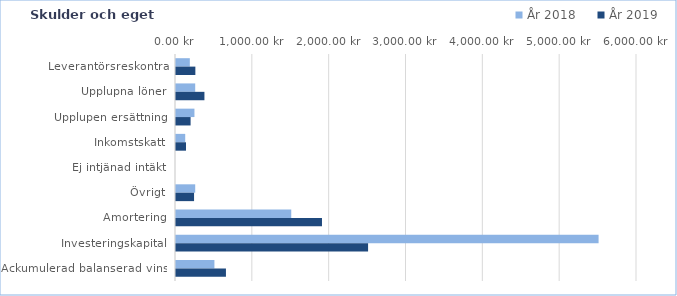
| Category | År 2018 | År 2019 |
|---|---|---|
| Leverantörsreskontra | 180 | 252 |
| Upplupna löner | 250 | 370 |
| Upplupen ersättning | 240 | 190 |
| Inkomstskatt | 120 | 130 |
| Ej intjänad intäkt | 0 | 0 |
| Övrigt | 250 | 235 |
| Amortering | 1500 | 1900 |
| Investeringskapital | 5500 | 2500 |
| Ackumulerad balanserad vinst | 500 | 650 |